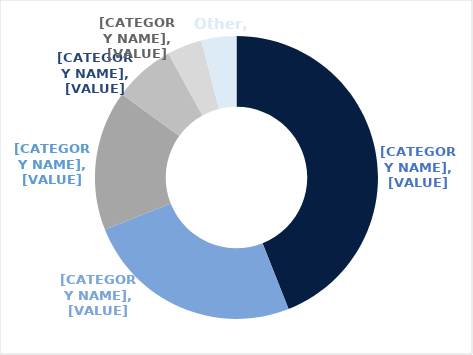
| Category | Series 0 |
|---|---|
| Regional | 0.44 |
| Sub regional | 0.25 |
| Outlet | 0.16 |
| Neighbourhood | 0.07 |
| CBD Retail | 0.04 |
| Other | 0.04 |